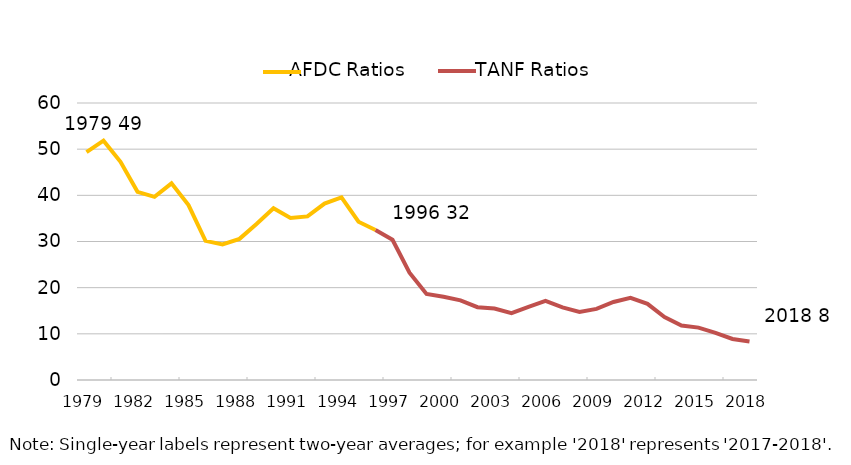
| Category | Alabama |
|---|---|
| 1979.0 | 49.346 |
| 1980.0 | 51.838 |
| 1981.0 | 47.256 |
| 1982.0 | 40.757 |
| 1983.0 | 39.666 |
| 1984.0 | 42.597 |
| 1985.0 | 37.889 |
| 1986.0 | 30.142 |
| 1987.0 | 29.376 |
| 1988.0 | 30.571 |
| 1989.0 | 33.79 |
| 1990.0 | 37.19 |
| 1991.0 | 35.101 |
| 1992.0 | 35.435 |
| 1993.0 | 38.219 |
| 1994.0 | 39.565 |
| 1995.0 | 34.28 |
| 1996.0 | 32.484 |
| 1997.0 | 30.371 |
| 1998.0 | 23.252 |
| 1999.0 | 18.642 |
| 2000.0 | 18.02 |
| 2001.0 | 17.243 |
| 2002.0 | 15.767 |
| 2003.0 | 15.474 |
| 2004.0 | 14.494 |
| 2005.0 | 15.862 |
| 2006.0 | 17.117 |
| 2007.0 | 15.714 |
| 2008.0 | 14.752 |
| 2009.0 | 15.411 |
| 2010.0 | 16.907 |
| 2011.0 | 17.807 |
| 2012.0 | 16.505 |
| 2013.0 | 13.647 |
| 2014.0 | 11.81 |
| 2015.0 | 11.351 |
| 2016.0 | 10.204 |
| 2017.0 | 8.896 |
| 2018.0 | 8.344 |